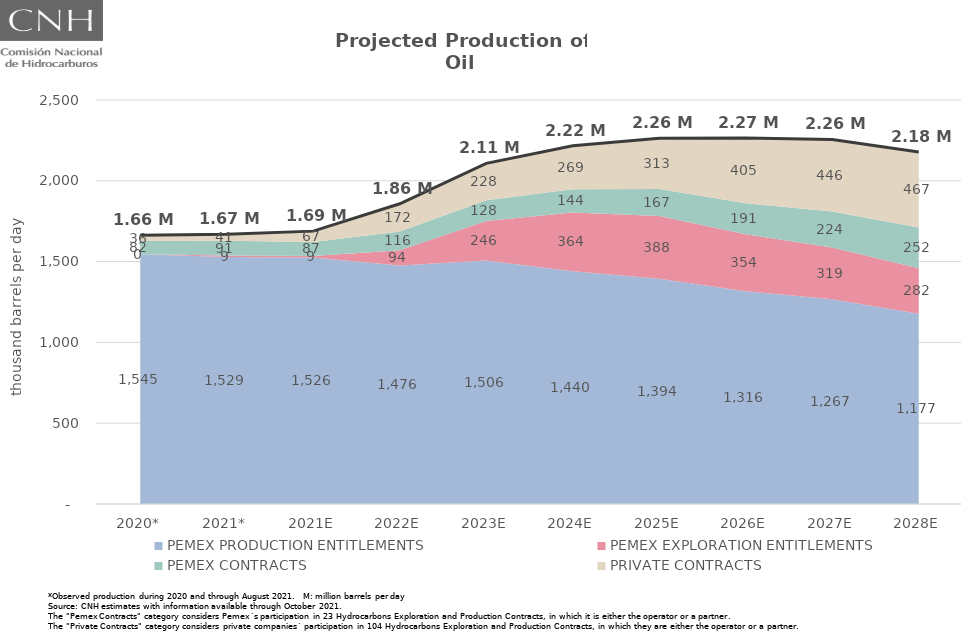
| Category | Total |
|---|---|
| 2020* | 1663.042 |
| 2021* | 1669.616 |
| 2021E | 1688.551 |
| 2022E | 1857.899 |
| 2023E | 2108.178 |
| 2024E | 2216.726 |
| 2025E | 2262.571 |
| 2026E | 2265.584 |
| 2027E | 2256.23 |
| 2028E | 2177.817 |